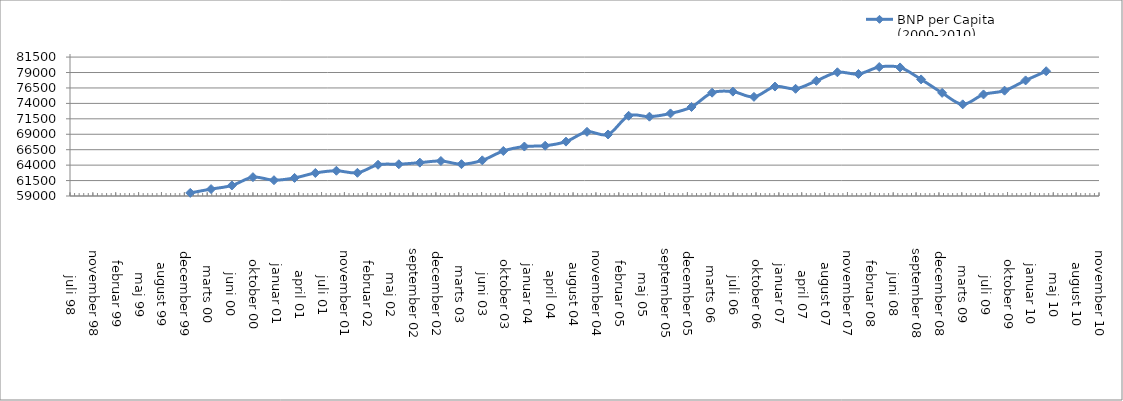
| Category | BNP per Capita (2000-2010) |
|---|---|
| 36526.0 | 59505 |
| 36617.0 | 60119 |
| 36708.0 | 60705 |
| 36800.0 | 62050 |
| 36892.0 | 61558 |
| 36982.0 | 61929 |
| 37073.0 | 62729 |
| 37165.0 | 63089 |
| 37257.0 | 62757 |
| 37347.0 | 64061 |
| 37438.0 | 64145 |
| 37530.0 | 64401 |
| 37622.0 | 64668 |
| 37712.0 | 64154 |
| 37803.0 | 64776 |
| 37895.0 | 66291 |
| 37987.0 | 67011 |
| 38078.0 | 67141 |
| 38169.0 | 67809 |
| 38261.0 | 69397 |
| 38353.0 | 68964 |
| 38443.0 | 71990 |
| 38534.0 | 71846 |
| 38626.0 | 72375 |
| 38718.0 | 73418 |
| 38808.0 | 75734 |
| 38899.0 | 75906 |
| 38991.0 | 75056 |
| 39083.0 | 76727 |
| 39173.0 | 76363 |
| 39264.0 | 77652 |
| 39356.0 | 79038 |
| 39448.0 | 78758 |
| 39539.0 | 79890 |
| 39630.0 | 79822 |
| 39722.0 | 77883 |
| 39814.0 | 75705 |
| 39904.0 | 73848 |
| 39995.0 | 75450 |
| 40087.0 | 76062 |
| 40179.0 | 77722 |
| 40269.0 | 79209 |